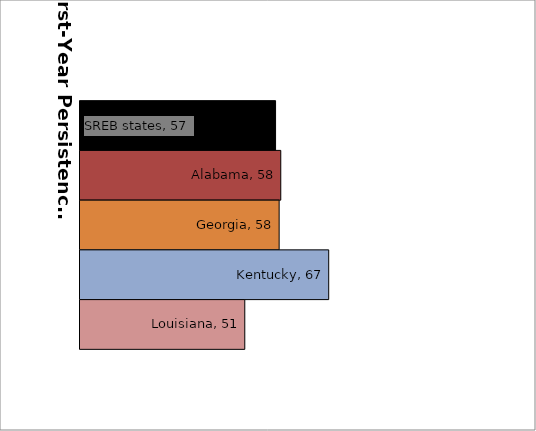
| Category | SREB states | Alabama | Georgia | Kentucky | Louisiana |
|---|---|---|---|---|---|
| 0 | 57.34 | 58.333 | 58.023 | 67.486 | 51.463 |